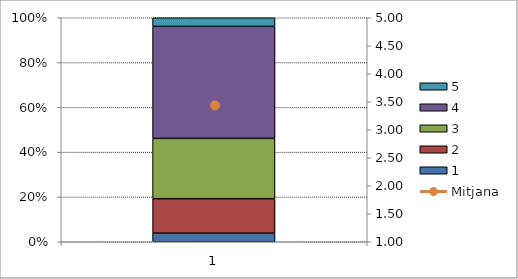
| Category | 1 | 2 | 3 | 4 | 5 |
|---|---|---|---|---|---|
| 0 | 1 | 4 | 7 | 13 | 1 |